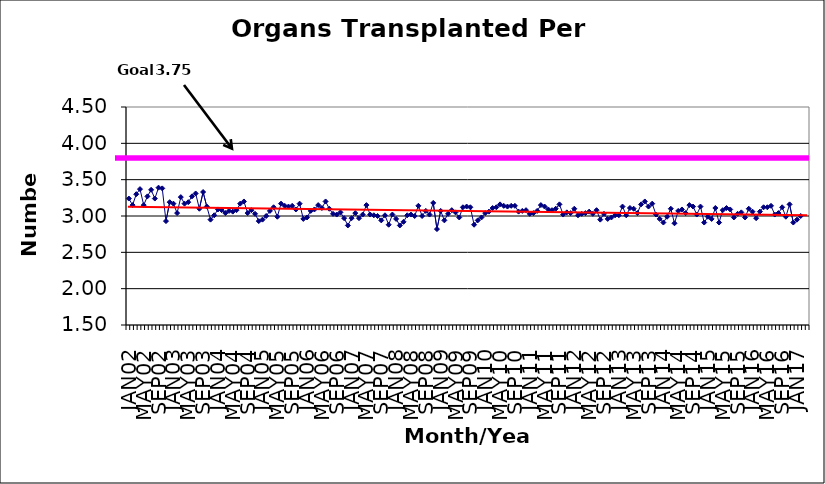
| Category | Series 0 |
|---|---|
| JAN02 | 3.24 |
| FEB02 | 3.15 |
| MAR02 | 3.3 |
| APR02 | 3.37 |
| MAY02 | 3.15 |
| JUN02 | 3.27 |
| JUL02 | 3.36 |
| AUG02 | 3.24 |
| SEP02 | 3.39 |
| OCT02 | 3.38 |
| NOV02 | 2.93 |
| DEC02 | 3.19 |
| JAN03 | 3.17 |
| FEB03 | 3.04 |
| MAR03 | 3.26 |
| APR03 | 3.17 |
| MAY03 | 3.19 |
| JUN03 | 3.27 |
| JUL03 | 3.31 |
| AUG03 | 3.1 |
| SEP03 | 3.33 |
| OCT03 | 3.13 |
| NOV03 | 2.95 |
| DEC03 | 3.01 |
| JAN04 | 3.09 |
| FEB04 | 3.08 |
| MAR04 | 3.04 |
| APR04 | 3.07 |
| MAY04 | 3.06 |
| JUN04 | 3.08 |
| JUL04 | 3.17 |
| AUG04 | 3.2 |
| SEP04 | 3.04 |
| OCT04 | 3.08 |
| NOV04 | 3.03 |
| DEC04 | 2.93 |
| JAN05 | 2.95 |
| FEB05 | 3 |
| MAR05 | 3.07 |
| APR05 | 3.12 |
| MAY05 | 2.99 |
| JUN05 | 3.17 |
| JUL05 | 3.14 |
| AUG05 | 3.13 |
| SEP05 | 3.14 |
| OCT05 | 3.09 |
| NOV05 | 3.17 |
| DEC05 | 2.96 |
| JAN06 | 2.98 |
| FEB06 | 3.07 |
| MAR06 | 3.09 |
| APR06 | 3.15 |
| MAY06 | 3.11 |
| JUN06 | 3.2 |
| JUL06 | 3.1 |
| AUG06 | 3.03 |
| SEP06 | 3.02 |
| OCT06 | 3.05 |
| NOV06 | 2.97 |
| DEC06 | 2.87 |
| JAN07 | 2.97 |
| FEB07 | 3.04 |
| MAR07 | 2.97 |
| APR07 | 3.02 |
| MAY07 | 3.15 |
| JUN07 | 3.02 |
| JUL07 | 3.01 |
| AUG07 | 3 |
| SEP07 | 2.94 |
| OCT07 | 3.01 |
| NOV07 | 2.88 |
| DEC07 | 3.02 |
| JAN08 | 2.96 |
| FEB08 | 2.87 |
| MAR08 | 2.92 |
| APR08 | 3.01 |
| MAY08 | 3.02 |
| JUN08 | 3 |
| JUL08 | 3.14 |
| AUG08 | 3 |
| SEP08 | 3.07 |
| OCT08 | 3.02 |
| NOV08 | 3.18 |
| DEC08 | 2.82 |
| JAN09 | 3.07 |
| FEB09 | 2.94 |
| MAR09 | 3.03 |
| APR09 | 3.08 |
| MAY09 | 3.05 |
| JUN09 | 2.98 |
| JUL09 | 3.12 |
| AUG09 | 3.13 |
| SEP09 | 3.12 |
| OCT09 | 2.88 |
| NOV09 | 2.94 |
| DEC09 | 2.98 |
| JAN10 | 3.04 |
| FEB10 | 3.06 |
| MAR10 | 3.11 |
| APR10 | 3.12 |
| MAY10 | 3.16 |
| JUN10 | 3.14 |
| JUL10 | 3.13 |
| AUG10 | 3.14 |
| SEP10 | 3.14 |
| OCT10 | 3.06 |
| NOV10 | 3.07 |
| DEC10 | 3.08 |
| JAN11 | 3.03 |
| FEB11 | 3.04 |
| MAR11 | 3.07 |
| APR11 | 3.15 |
| MAY11 | 3.13 |
| JUN11 | 3.09 |
| JUL11 | 3.08 |
| AUG11 | 3.1 |
| SEP11 | 3.16 |
| OCT11 | 3.02 |
| NOV11 | 3.05 |
| DEC11 | 3.04 |
| JAN12 | 3.1 |
| FEB12 | 3.01 |
| MAR12 | 3.03 |
| APR12 | 3.04 |
| MAY12 | 3.06 |
| JUN12 | 3.03 |
| JUL12 | 3.08 |
| AUG12 | 2.95 |
| SEP12 | 3.03 |
| OCT12 | 2.96 |
| NOV12 | 2.98 |
| DEC12 | 3.01 |
| JAN13 | 3.01 |
| FEB13 | 3.13 |
| MAR13 | 3.01 |
| APR13 | 3.11 |
| MAY13 | 3.1 |
| JUN13 | 3.04 |
| JUL13 | 3.16 |
| AUG13 | 3.2 |
| SEP13 | 3.13 |
| OCT13 | 3.17 |
| NOV13 | 3.02 |
| DEC13 | 2.96 |
| JAN14 | 2.91 |
| FEB14 | 2.99 |
| MAR14 | 3.1 |
| APR14 | 2.9 |
| MAY14 | 3.07 |
| JUN14 | 3.09 |
| JUL14 | 3.04 |
| AUG14 | 3.15 |
| SEP14 | 3.13 |
| OCT14 | 3.02 |
| NOV14 | 3.13 |
| DEC14 | 2.91 |
| JAN15 | 2.99 |
| FEB15 | 2.96 |
| MAR15 | 3.11 |
| APR15 | 2.91 |
| MAY15 | 3.08 |
| JUN15 | 3.11 |
| JUL15 | 3.09 |
| AUG15 | 2.98 |
| SEP15 | 3.03 |
| OCT15 | 3.05 |
| NOV15 | 2.98 |
| DEC15 | 3.1 |
| JAN16 | 3.06 |
| FEB16 | 2.97 |
| MAR16 | 3.06 |
| APR16 | 3.12 |
| MAY16 | 3.12 |
| JUN16 | 3.14 |
| JUL16 | 3.02 |
| AUG16 | 3.04 |
| SEP16 | 3.12 |
| OCT16 | 2.99 |
| NOV16 | 3.16 |
| DEC16 | 2.91 |
| JAN17 | 2.95 |
| FEB17 | 3 |